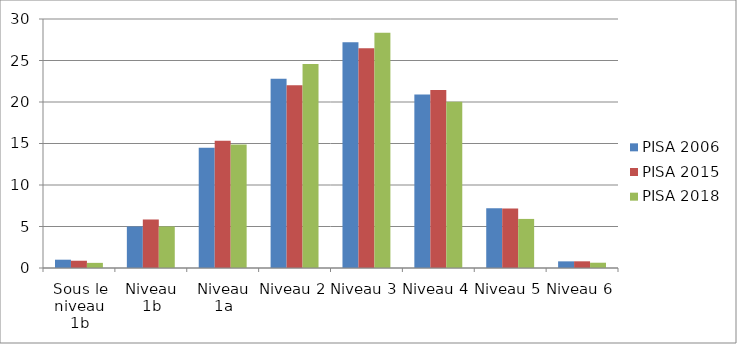
| Category | PISA 2006 | PISA 2015 | PISA 2018 |
|---|---|---|---|
| Sous le niveau 1b | 1 | 0.875 | 0.619 |
| Niveau 1b | 5 | 5.844 | 5.005 |
| Niveau 1a | 14.5 | 15.341 | 14.892 |
| Niveau 2 | 22.8 | 22.03 | 24.574 |
| Niveau 3 | 27.2 | 26.476 | 28.346 |
| Niveau 4 | 20.9 | 21.447 | 20.03 |
| Niveau 5 | 7.2 | 7.181 | 5.913 |
| Niveau 6 | 0.8 | 0.805 | 0.638 |